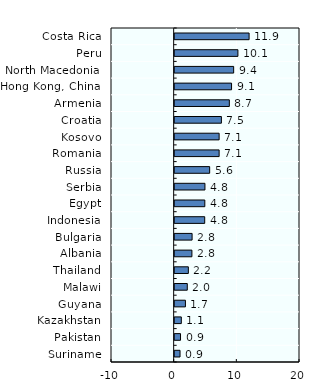
| Category | Pension funds |
|---|---|
| Costa Rica | 11.877 |
| Peru | 10.092 |
| North Macedonia | 9.414 |
| Hong Kong, China | 9.078 |
| Armenia | 8.723 |
| Croatia | 7.458 |
| Kosovo | 7.095 |
| Romania | 7.095 |
| Russia | 5.584 |
| Serbia | 4.831 |
| Egypt | 4.811 |
| Indonesia | 4.795 |
| Bulgaria | 2.782 |
| Albania | 2.753 |
| Thailand | 2.184 |
| Malawi | 2.015 |
| Guyana | 1.718 |
| Kazakhstan | 1.061 |
| Pakistan | 0.935 |
| Suriname | 0.857 |